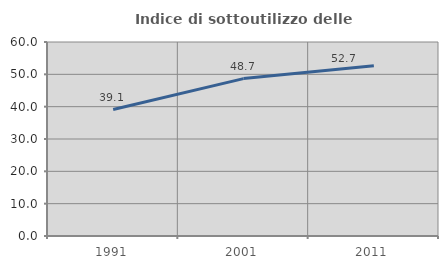
| Category | Indice di sottoutilizzo delle abitazioni  |
|---|---|
| 1991.0 | 39.113 |
| 2001.0 | 48.684 |
| 2011.0 | 52.673 |